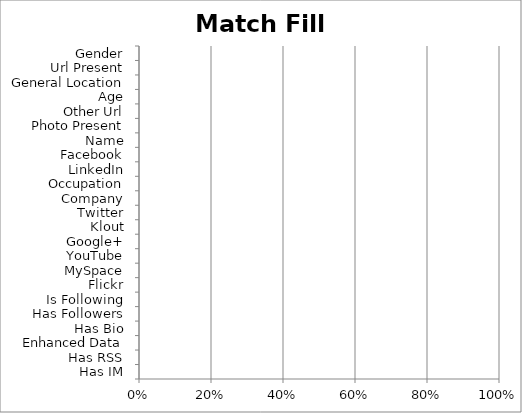
| Category | Match Fill Rate |
|---|---|
| Has IM | 0 |
| Has RSS | 0 |
| Enhanced Data | 0 |
| Has Bio | 0 |
| Has Followers | 0 |
| Is Following | 0 |
| Flickr | 0 |
| MySpace | 0 |
| YouTube | 0 |
| Google+ | 0 |
| Klout | 0 |
| Twitter | 0 |
| Company | 0 |
| Occupation | 0 |
| LinkedIn | 0 |
| Facebook | 0 |
| Name | 0 |
| Photo Present | 0 |
| Other Url | 0 |
| Age | 0 |
| General Location | 0 |
| Url Present | 0 |
| Gender | 0 |